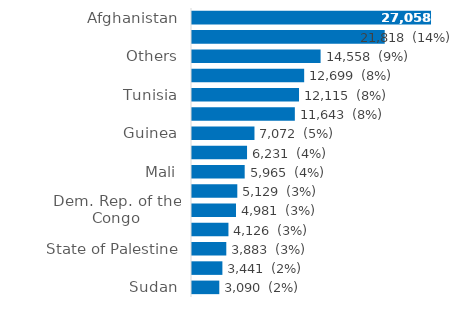
| Category | Series 0 |
|---|---|
| Afghanistan | 27058 |
| Syrian Arab Rep. | 21818 |
| Others | 14558 |
| Algeria | 12699 |
| Tunisia | 12115 |
| Morocco | 11643 |
| Guinea | 7072 |
| Côte d'Ivoire | 6231 |
| Mali | 5965 |
| Iraq | 5129 |
| Dem. Rep. of the Congo | 4981 |
| Bangladesh | 4126 |
| State of Palestine | 3883 |
| Senegal | 3441 |
| Sudan | 3090 |